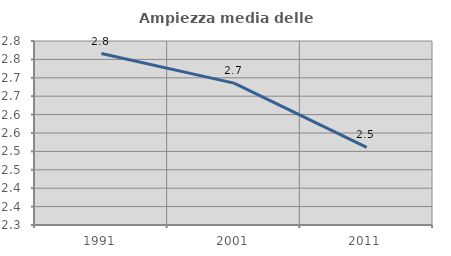
| Category | Ampiezza media delle famiglie |
|---|---|
| 1991.0 | 2.766 |
| 2001.0 | 2.686 |
| 2011.0 | 2.511 |